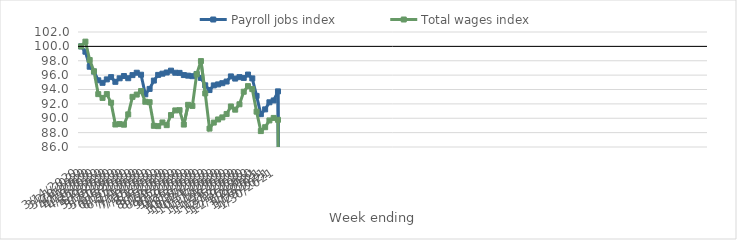
| Category | Payroll jobs index | Total wages index |
|---|---|---|
| 14/03/2020 | 100 | 100 |
| 21/03/2020 | 99.258 | 100.657 |
| 28/03/2020 | 97.169 | 98.1 |
| 04/04/2020 | 96.494 | 96.526 |
| 11/04/2020 | 95.28 | 93.355 |
| 18/04/2020 | 94.929 | 92.829 |
| 25/04/2020 | 95.406 | 93.364 |
| 02/05/2020 | 95.721 | 92.161 |
| 09/05/2020 | 95.069 | 89.129 |
| 16/05/2020 | 95.558 | 89.187 |
| 23/05/2020 | 95.874 | 89.104 |
| 30/05/2020 | 95.567 | 90.54 |
| 06/06/2020 | 96.002 | 92.976 |
| 13/06/2020 | 96.334 | 93.295 |
| 20/06/2020 | 96.057 | 93.777 |
| 27/06/2020 | 93.333 | 92.298 |
| 04/07/2020 | 94.081 | 92.234 |
| 11/07/2020 | 95.241 | 88.948 |
| 18/07/2020 | 96.032 | 88.904 |
| 25/07/2020 | 96.2 | 89.415 |
| 01/08/2020 | 96.366 | 89.04 |
| 08/08/2020 | 96.623 | 90.445 |
| 15/08/2020 | 96.332 | 91.089 |
| 22/08/2020 | 96.311 | 91.126 |
| 29/08/2020 | 96.008 | 89.122 |
| 05/09/2020 | 95.928 | 91.868 |
| 12/09/2020 | 95.853 | 91.717 |
| 19/09/2020 | 96.162 | 96.12 |
| 26/09/2020 | 95.611 | 97.955 |
| 03/10/2020 | 94.582 | 93.455 |
| 10/10/2020 | 93.923 | 88.562 |
| 17/10/2020 | 94.571 | 89.398 |
| 24/10/2020 | 94.71 | 89.831 |
| 31/10/2020 | 94.878 | 90.118 |
| 07/11/2020 | 95.107 | 90.596 |
| 14/11/2020 | 95.82 | 91.64 |
| 21/11/2020 | 95.52 | 91.195 |
| 28/11/2020 | 95.72 | 91.944 |
| 05/12/2020 | 95.612 | 93.689 |
| 12/12/2020 | 96.08 | 94.468 |
| 19/12/2020 | 95.544 | 94.055 |
| 26/12/2020 | 93.11 | 90.916 |
| 02/01/2021 | 90.57 | 88.214 |
| 09/01/2021 | 91.236 | 88.754 |
| 16/01/2021 | 92.221 | 89.696 |
| 23/01/2021 | 92.475 | 90.044 |
| 30/01/2021 | 93.74 | 89.782 |